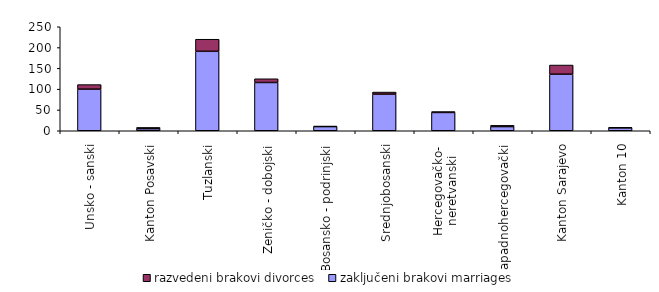
| Category | zaključeni brakovi marriages | razvedeni brakovi divorces |
|---|---|---|
| Unsko - sanski | 100 | 11 |
| Kanton Posavski | 5 | 3 |
| Tuzlanski | 191 | 29 |
| Zeničko - dobojski | 116 | 9 |
| Bosansko - podrinjski | 10 | 1 |
| Srednjobosanski | 88 | 5 |
| Hercegovačko-
neretvanski | 44 | 2 |
| Zapadnohercegovački | 10 | 3 |
| Kanton Sarajevo | 136 | 22 |
| Kanton 10 | 7 | 1 |